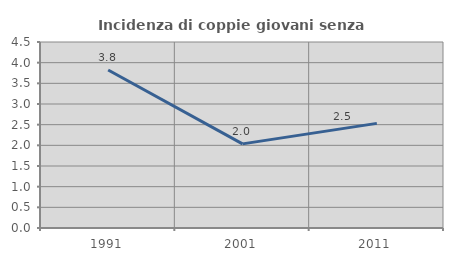
| Category | Incidenza di coppie giovani senza figli |
|---|---|
| 1991.0 | 3.824 |
| 2001.0 | 2.036 |
| 2011.0 | 2.532 |